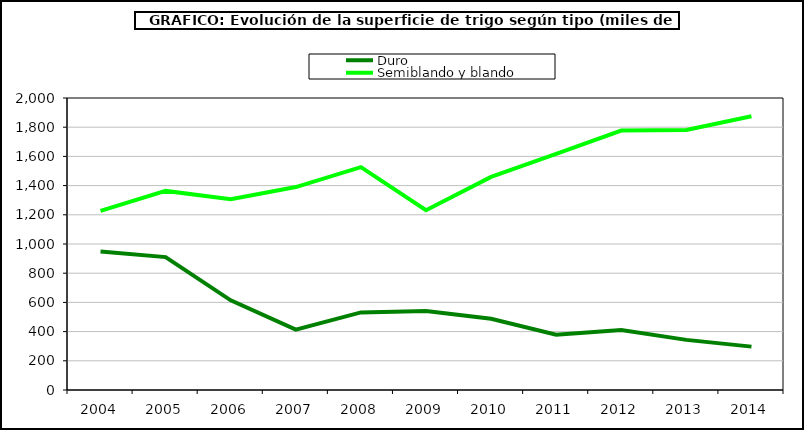
| Category | Duro | Semiblando y blando |
|---|---|---|
| 2004 | 948.707 | 1226.321 |
| 2005 | 910.448 | 1363.661 |
| 2006 | 614.021 | 1306.212 |
| 2007 | 413.41 | 1389.903 |
| 2008 | 531.661 | 1526.209 |
| 2009 | 541.581 | 1231.171 |
| 2010 | 488.306 | 1459.767 |
| 2011 | 378.054 | 1616.599 |
| 2012 | 411.053 | 1777.118 |
| 2013 | 343.389 | 1781.58 |
| 2014 | 297.13 | 1874.542 |